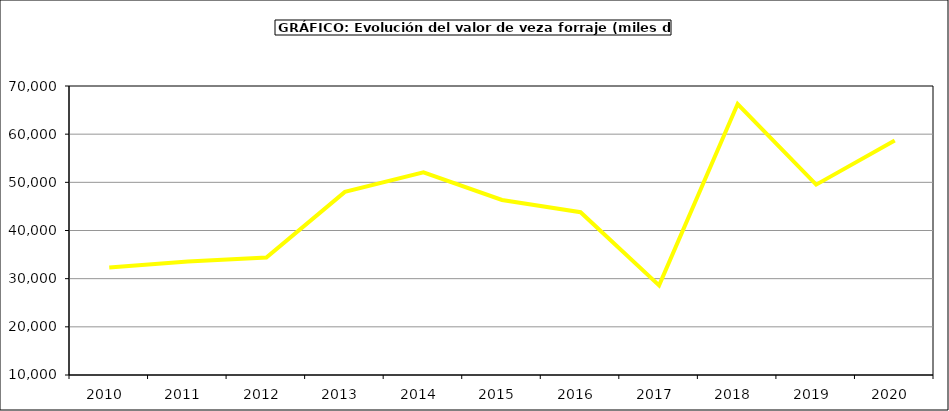
| Category | Valor |
|---|---|
| 2010.0 | 32296.558 |
| 2011.0 | 33540.553 |
| 2012.0 | 34393.555 |
| 2013.0 | 48025.512 |
| 2014.0 | 52077.137 |
| 2015.0 | 46338 |
| 2016.0 | 43806 |
| 2017.0 | 28604.284 |
| 2018.0 | 66265.658 |
| 2019.0 | 49524.023 |
| 2020.0 | 58696.539 |